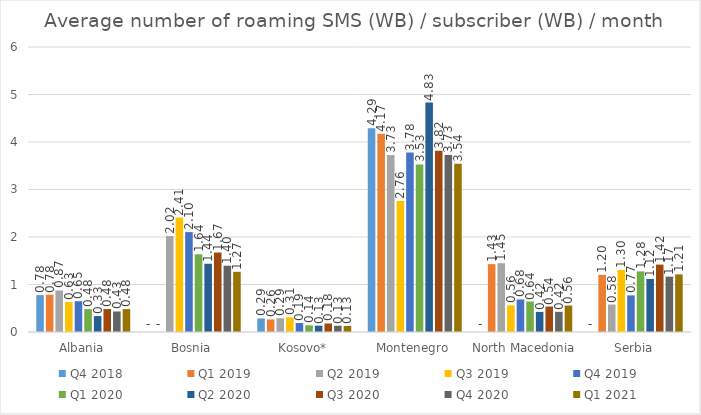
| Category | Q4 2018 | Q1 2019 | Q2 2019 | Q3 2019 | Q4 2019 | Q1 2020 | Q2 2020 | Q3 2020 | Q4 2020 | Q1 2021 |
|---|---|---|---|---|---|---|---|---|---|---|
| Albania | 0.776 | 0.785 | 0.874 | 0.631 | 0.648 | 0.483 | 0.335 | 0.483 | 0.433 | 0.482 |
| Bosnia | 0 | 0 | 2.022 | 2.408 | 2.103 | 1.636 | 1.437 | 1.673 | 1.395 | 1.267 |
| Kosovo* | 0.285 | 0.264 | 0.29 | 0.308 | 0.189 | 0.141 | 0.134 | 0.18 | 0.132 | 0.126 |
| Montenegro | 4.287 | 4.175 | 3.727 | 2.756 | 3.778 | 3.529 | 4.83 | 3.818 | 3.727 | 3.54 |
| North Macedonia | 0 | 1.429 | 1.448 | 0.561 | 0.684 | 0.641 | 0.424 | 0.536 | 0.425 | 0.557 |
| Serbia | 0 | 1.204 | 0.579 | 1.305 | 0.771 | 1.276 | 1.117 | 1.419 | 1.166 | 1.213 |